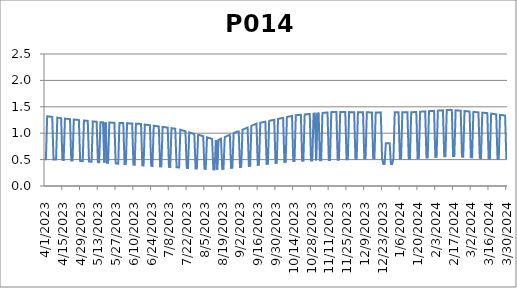
| Category | P014 |
|---|---|
| 4/1/23 | 0.508 |
| 4/2/23 | 0.507 |
| 4/3/23 | 1.321 |
| 4/4/23 | 1.318 |
| 4/5/23 | 1.314 |
| 4/6/23 | 1.311 |
| 4/7/23 | 1.308 |
| 4/8/23 | 0.502 |
| 4/9/23 | 0.501 |
| 4/10/23 | 0.5 |
| 4/11/23 | 1.295 |
| 4/12/23 | 1.291 |
| 4/13/23 | 1.288 |
| 4/14/23 | 1.285 |
| 4/15/23 | 0.496 |
| 4/16/23 | 0.494 |
| 4/17/23 | 1.277 |
| 4/18/23 | 1.274 |
| 4/19/23 | 1.272 |
| 4/20/23 | 1.269 |
| 4/21/23 | 1.267 |
| 4/22/23 | 0.485 |
| 4/23/23 | 0.483 |
| 4/24/23 | 1.26 |
| 4/25/23 | 1.257 |
| 4/26/23 | 1.255 |
| 4/27/23 | 1.253 |
| 4/28/23 | 1.25 |
| 4/29/23 | 0.474 |
| 4/30/23 | 0.472 |
| 5/1/23 | 0.471 |
| 5/2/23 | 1.241 |
| 5/3/23 | 1.238 |
| 5/4/23 | 1.236 |
| 5/5/23 | 1.233 |
| 5/6/23 | 0.463 |
| 5/7/23 | 0.461 |
| 5/8/23 | 0.46 |
| 5/9/23 | 1.224 |
| 5/10/23 | 1.221 |
| 5/11/23 | 1.219 |
| 5/12/23 | 1.217 |
| 5/13/23 | 0.452 |
| 5/14/23 | 0.45 |
| 5/15/23 | 1.209 |
| 5/16/23 | 1.208 |
| 5/17/23 | 1.207 |
| 5/18/23 | 0.443 |
| 5/19/23 | 1.205 |
| 5/20/23 | 0.44 |
| 5/21/23 | 0.438 |
| 5/22/23 | 1.202 |
| 5/23/23 | 1.201 |
| 5/24/23 | 1.2 |
| 5/25/23 | 1.199 |
| 5/26/23 | 1.197 |
| 5/27/23 | 0.427 |
| 5/28/23 | 0.425 |
| 5/29/23 | 0.423 |
| 5/30/23 | 1.193 |
| 5/31/23 | 1.192 |
| 6/1/23 | 1.192 |
| 6/2/23 | 1.191 |
| 6/3/23 | 0.416 |
| 6/4/23 | 0.414 |
| 6/5/23 | 1.188 |
| 6/6/23 | 1.186 |
| 6/7/23 | 1.185 |
| 6/8/23 | 1.184 |
| 6/9/23 | 1.183 |
| 6/10/23 | 0.403 |
| 6/11/23 | 0.402 |
| 6/12/23 | 1.18 |
| 6/13/23 | 1.179 |
| 6/14/23 | 1.178 |
| 6/15/23 | 1.177 |
| 6/16/23 | 1.173 |
| 6/17/23 | 0.391 |
| 6/18/23 | 0.39 |
| 6/19/23 | 1.164 |
| 6/20/23 | 1.16 |
| 6/21/23 | 1.157 |
| 6/22/23 | 1.154 |
| 6/23/23 | 1.151 |
| 6/24/23 | 0.382 |
| 6/25/23 | 0.381 |
| 6/26/23 | 1.141 |
| 6/27/23 | 1.138 |
| 6/28/23 | 1.134 |
| 6/29/23 | 1.131 |
| 6/30/23 | 1.128 |
| 7/1/23 | 0.372 |
| 7/2/23 | 0.371 |
| 7/3/23 | 1.118 |
| 7/4/23 | 1.115 |
| 7/5/23 | 1.112 |
| 7/6/23 | 1.109 |
| 7/7/23 | 1.105 |
| 7/8/23 | 0.363 |
| 7/9/23 | 0.361 |
| 7/10/23 | 1.096 |
| 7/11/23 | 1.092 |
| 7/12/23 | 1.089 |
| 7/13/23 | 1.086 |
| 7/14/23 | 0.354 |
| 7/15/23 | 0.353 |
| 7/16/23 | 0.352 |
| 7/17/23 | 1.065 |
| 7/18/23 | 1.058 |
| 7/19/23 | 1.051 |
| 7/20/23 | 1.043 |
| 7/21/23 | 1.036 |
| 7/22/23 | 0.343 |
| 7/23/23 | 0.342 |
| 7/24/23 | 1.015 |
| 7/25/23 | 1.007 |
| 7/26/23 | 1 |
| 7/27/23 | 0.993 |
| 7/28/23 | 0.986 |
| 7/29/23 | 0.333 |
| 7/30/23 | 0.332 |
| 7/31/23 | 0.964 |
| 8/1/23 | 0.964 |
| 8/2/23 | 0.957 |
| 8/3/23 | 0.95 |
| 8/4/23 | 0.942 |
| 8/5/23 | 0.325 |
| 8/6/23 | 0.324 |
| 8/7/23 | 0.921 |
| 8/8/23 | 0.914 |
| 8/9/23 | 0.906 |
| 8/10/23 | 0.899 |
| 8/11/23 | 0.892 |
| 8/12/23 | 0.315 |
| 8/13/23 | 0.314 |
| 8/14/23 | 0.87 |
| 8/15/23 | 0.311 |
| 8/16/23 | 0.874 |
| 8/17/23 | 0.884 |
| 8/18/23 | 0.895 |
| 8/19/23 | 0.323 |
| 8/20/23 | 0.325 |
| 8/21/23 | 0.927 |
| 8/22/23 | 0.938 |
| 8/23/23 | 0.948 |
| 8/24/23 | 0.959 |
| 8/25/23 | 0.969 |
| 8/26/23 | 0.343 |
| 8/27/23 | 0.346 |
| 8/28/23 | 1.001 |
| 8/29/23 | 1.012 |
| 8/30/23 | 1.022 |
| 8/31/23 | 1.033 |
| 9/1/23 | 1.033 |
| 9/2/23 | 0.36 |
| 9/3/23 | 0.363 |
| 9/4/23 | 1.065 |
| 9/5/23 | 1.076 |
| 9/6/23 | 1.086 |
| 9/7/23 | 1.097 |
| 9/8/23 | 1.107 |
| 9/9/23 | 0.38 |
| 9/10/23 | 0.383 |
| 9/11/23 | 1.139 |
| 9/12/23 | 1.15 |
| 9/13/23 | 1.16 |
| 9/14/23 | 1.171 |
| 9/15/23 | 1.182 |
| 9/16/23 | 0.4 |
| 9/17/23 | 0.402 |
| 9/18/23 | 1.197 |
| 9/19/23 | 1.203 |
| 9/20/23 | 1.208 |
| 9/21/23 | 1.213 |
| 9/22/23 | 1.218 |
| 9/23/23 | 0.418 |
| 9/24/23 | 0.421 |
| 9/25/23 | 1.234 |
| 9/26/23 | 1.239 |
| 9/27/23 | 1.244 |
| 9/28/23 | 1.249 |
| 9/29/23 | 1.255 |
| 9/30/23 | 0.436 |
| 10/1/23 | 0.439 |
| 10/2/23 | 1.27 |
| 10/3/23 | 1.275 |
| 10/4/23 | 1.281 |
| 10/5/23 | 1.286 |
| 10/6/23 | 1.291 |
| 10/7/23 | 0.454 |
| 10/8/23 | 0.457 |
| 10/9/23 | 1.307 |
| 10/10/23 | 1.312 |
| 10/11/23 | 1.317 |
| 10/12/23 | 1.322 |
| 10/13/23 | 1.328 |
| 10/14/23 | 0.472 |
| 10/15/23 | 0.475 |
| 10/16/23 | 1.34 |
| 10/17/23 | 1.342 |
| 10/18/23 | 1.345 |
| 10/19/23 | 1.347 |
| 10/20/23 | 1.349 |
| 10/21/23 | 0.479 |
| 10/22/23 | 0.479 |
| 10/23/23 | 1.355 |
| 10/24/23 | 1.357 |
| 10/25/23 | 1.36 |
| 10/26/23 | 1.362 |
| 10/27/23 | 1.364 |
| 10/28/23 | 0.484 |
| 10/29/23 | 0.484 |
| 10/30/23 | 1.37 |
| 10/31/23 | 1.373 |
| 11/1/23 | 0.486 |
| 11/2/23 | 1.375 |
| 11/3/23 | 1.377 |
| 11/4/23 | 0.488 |
| 11/5/23 | 0.488 |
| 11/6/23 | 1.383 |
| 11/7/23 | 1.386 |
| 11/8/23 | 1.388 |
| 11/9/23 | 1.39 |
| 11/10/23 | 1.392 |
| 11/11/23 | 0.492 |
| 11/12/23 | 0.493 |
| 11/13/23 | 1.399 |
| 11/14/23 | 1.401 |
| 11/15/23 | 1.403 |
| 11/16/23 | 1.403 |
| 11/17/23 | 1.402 |
| 11/18/23 | 0.498 |
| 11/19/23 | 0.499 |
| 11/20/23 | 1.401 |
| 11/21/23 | 1.401 |
| 11/22/23 | 1.401 |
| 11/23/23 | 1.401 |
| 11/24/23 | 1.4 |
| 11/25/23 | 0.505 |
| 11/26/23 | 0.506 |
| 11/27/23 | 1.399 |
| 11/28/23 | 1.399 |
| 11/29/23 | 1.399 |
| 11/30/23 | 1.398 |
| 12/1/23 | 1.398 |
| 12/2/23 | 0.513 |
| 12/3/23 | 0.514 |
| 12/4/23 | 1.397 |
| 12/5/23 | 1.397 |
| 12/6/23 | 1.397 |
| 12/7/23 | 1.396 |
| 12/8/23 | 1.396 |
| 12/9/23 | 0.52 |
| 12/10/23 | 0.521 |
| 12/11/23 | 1.395 |
| 12/12/23 | 1.395 |
| 12/13/23 | 1.394 |
| 12/14/23 | 1.394 |
| 12/15/23 | 1.394 |
| 12/16/23 | 0.526 |
| 12/17/23 | 0.525 |
| 12/18/23 | 1.394 |
| 12/19/23 | 1.394 |
| 12/20/23 | 1.394 |
| 12/21/23 | 1.394 |
| 12/22/23 | 1.394 |
| 12/23/23 | 0.524 |
| 12/24/23 | 0.419 |
| 12/25/23 | 0.419 |
| 12/26/23 | 0.807 |
| 12/27/23 | 0.807 |
| 12/28/23 | 0.807 |
| 12/29/23 | 0.807 |
| 12/30/23 | 0.419 |
| 12/31/23 | 0.419 |
| 1/1/24 | 0.521 |
| 1/2/24 | 1.395 |
| 1/3/24 | 1.395 |
| 1/4/24 | 1.395 |
| 1/5/24 | 1.395 |
| 1/6/24 | 0.52 |
| 1/7/24 | 0.52 |
| 1/8/24 | 1.396 |
| 1/9/24 | 1.396 |
| 1/10/24 | 1.396 |
| 1/11/24 | 1.396 |
| 1/12/24 | 1.396 |
| 1/13/24 | 0.518 |
| 1/14/24 | 0.517 |
| 1/15/24 | 1.396 |
| 1/16/24 | 1.398 |
| 1/17/24 | 1.399 |
| 1/18/24 | 1.401 |
| 1/19/24 | 1.402 |
| 1/20/24 | 0.526 |
| 1/21/24 | 0.528 |
| 1/22/24 | 1.407 |
| 1/23/24 | 1.408 |
| 1/24/24 | 1.41 |
| 1/25/24 | 1.412 |
| 1/26/24 | 1.413 |
| 1/27/24 | 0.539 |
| 1/28/24 | 0.541 |
| 1/29/24 | 1.418 |
| 1/30/24 | 1.419 |
| 1/31/24 | 1.421 |
| 2/1/24 | 1.421 |
| 2/2/24 | 1.422 |
| 2/3/24 | 0.55 |
| 2/4/24 | 0.552 |
| 2/5/24 | 1.427 |
| 2/6/24 | 1.428 |
| 2/7/24 | 1.43 |
| 2/8/24 | 1.432 |
| 2/9/24 | 1.433 |
| 2/10/24 | 0.563 |
| 2/11/24 | 0.565 |
| 2/12/24 | 1.438 |
| 2/13/24 | 1.439 |
| 2/14/24 | 1.441 |
| 2/15/24 | 1.442 |
| 2/16/24 | 1.44 |
| 2/17/24 | 0.569 |
| 2/18/24 | 0.568 |
| 2/19/24 | 1.434 |
| 2/20/24 | 1.432 |
| 2/21/24 | 1.43 |
| 2/22/24 | 1.428 |
| 2/23/24 | 1.426 |
| 2/24/24 | 0.558 |
| 2/25/24 | 0.556 |
| 2/26/24 | 1.42 |
| 2/27/24 | 1.418 |
| 2/28/24 | 1.416 |
| 2/29/24 | 1.413 |
| 3/1/24 | 1.409 |
| 3/2/24 | 0.544 |
| 3/3/24 | 0.543 |
| 3/4/24 | 1.403 |
| 3/5/24 | 1.401 |
| 3/6/24 | 1.399 |
| 3/7/24 | 1.397 |
| 3/8/24 | 1.395 |
| 3/9/24 | 0.533 |
| 3/10/24 | 0.531 |
| 3/11/24 | 1.389 |
| 3/12/24 | 1.387 |
| 3/13/24 | 1.385 |
| 3/14/24 | 1.383 |
| 3/15/24 | 1.38 |
| 3/16/24 | 0.522 |
| 3/17/24 | 0.521 |
| 3/18/24 | 1.371 |
| 3/19/24 | 1.367 |
| 3/20/24 | 1.364 |
| 3/21/24 | 1.361 |
| 3/22/24 | 1.357 |
| 3/23/24 | 0.515 |
| 3/24/24 | 0.515 |
| 3/25/24 | 1.347 |
| 3/26/24 | 1.344 |
| 3/27/24 | 1.341 |
| 3/28/24 | 1.338 |
| 3/29/24 | 1.334 |
| 3/30/24 | 0.509 |